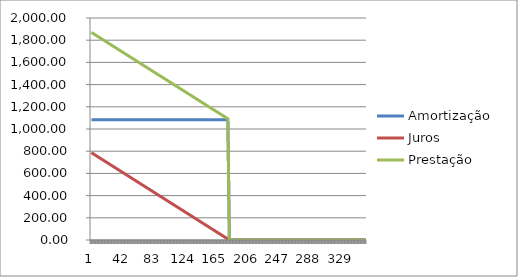
| Category | Amortização   | Juros   | Prestação   |
|---|---|---|---|
| 0 | 1083.546 | 786.837 | 1870.383 |
| 1 | 1083.546 | 782.466 | 1866.012 |
| 2 | 1083.546 | 778.094 | 1861.64 |
| 3 | 1083.546 | 773.723 | 1857.269 |
| 4 | 1083.546 | 769.352 | 1852.898 |
| 5 | 1083.546 | 764.981 | 1848.526 |
| 6 | 1083.546 | 760.609 | 1844.155 |
| 7 | 1083.546 | 756.238 | 1839.784 |
| 8 | 1083.546 | 751.867 | 1835.412 |
| 9 | 1083.546 | 747.495 | 1831.041 |
| 10 | 1083.546 | 743.124 | 1826.67 |
| 11 | 1083.546 | 738.753 | 1822.298 |
| 12 | 1083.546 | 734.381 | 1817.927 |
| 13 | 1083.546 | 730.01 | 1813.556 |
| 14 | 1083.546 | 725.639 | 1809.185 |
| 15 | 1083.546 | 721.267 | 1804.813 |
| 16 | 1083.546 | 716.896 | 1800.442 |
| 17 | 1083.546 | 712.525 | 1796.071 |
| 18 | 1083.546 | 708.153 | 1791.699 |
| 19 | 1083.546 | 703.782 | 1787.328 |
| 20 | 1083.546 | 699.411 | 1782.957 |
| 21 | 1083.546 | 695.039 | 1778.585 |
| 22 | 1083.546 | 690.668 | 1774.214 |
| 23 | 1083.546 | 686.297 | 1769.843 |
| 24 | 1083.546 | 681.926 | 1765.471 |
| 25 | 1083.546 | 677.554 | 1761.1 |
| 26 | 1083.546 | 673.183 | 1756.729 |
| 27 | 1083.546 | 668.812 | 1752.357 |
| 28 | 1083.546 | 664.44 | 1747.986 |
| 29 | 1083.546 | 660.069 | 1743.615 |
| 30 | 1083.546 | 655.698 | 1739.243 |
| 31 | 1083.546 | 651.326 | 1734.872 |
| 32 | 1083.546 | 646.955 | 1730.501 |
| 33 | 1083.546 | 642.584 | 1726.129 |
| 34 | 1083.546 | 638.212 | 1721.758 |
| 35 | 1083.546 | 633.841 | 1717.387 |
| 36 | 1083.546 | 629.47 | 1713.016 |
| 37 | 1083.546 | 625.098 | 1708.644 |
| 38 | 1083.546 | 620.727 | 1704.273 |
| 39 | 1083.546 | 616.356 | 1699.902 |
| 40 | 1083.546 | 611.984 | 1695.53 |
| 41 | 1083.546 | 607.613 | 1691.159 |
| 42 | 1083.546 | 603.242 | 1686.788 |
| 43 | 1083.546 | 598.87 | 1682.416 |
| 44 | 1083.546 | 594.499 | 1678.045 |
| 45 | 1083.546 | 590.128 | 1673.674 |
| 46 | 1083.546 | 585.757 | 1669.302 |
| 47 | 1083.546 | 581.385 | 1664.931 |
| 48 | 1083.546 | 577.014 | 1660.56 |
| 49 | 1083.546 | 572.643 | 1656.188 |
| 50 | 1083.546 | 568.271 | 1651.817 |
| 51 | 1083.546 | 563.9 | 1647.446 |
| 52 | 1083.546 | 559.529 | 1643.074 |
| 53 | 1083.546 | 555.157 | 1638.703 |
| 54 | 1083.546 | 550.786 | 1634.332 |
| 55 | 1083.546 | 546.415 | 1629.961 |
| 56 | 1083.546 | 542.043 | 1625.589 |
| 57 | 1083.546 | 537.672 | 1621.218 |
| 58 | 1083.546 | 533.301 | 1616.847 |
| 59 | 1083.546 | 528.929 | 1612.475 |
| 60 | 1083.546 | 524.558 | 1608.104 |
| 61 | 1083.546 | 520.187 | 1603.733 |
| 62 | 1083.546 | 515.815 | 1599.361 |
| 63 | 1083.546 | 511.444 | 1594.99 |
| 64 | 1083.546 | 507.073 | 1590.619 |
| 65 | 1083.546 | 502.702 | 1586.247 |
| 66 | 1083.546 | 498.33 | 1581.876 |
| 67 | 1083.546 | 493.959 | 1577.505 |
| 68 | 1083.546 | 489.588 | 1573.133 |
| 69 | 1083.546 | 485.216 | 1568.762 |
| 70 | 1083.546 | 480.845 | 1564.391 |
| 71 | 1083.546 | 476.474 | 1560.019 |
| 72 | 1083.546 | 472.102 | 1555.648 |
| 73 | 1083.546 | 467.731 | 1551.277 |
| 74 | 1083.546 | 463.36 | 1546.905 |
| 75 | 1083.546 | 458.988 | 1542.534 |
| 76 | 1083.546 | 454.617 | 1538.163 |
| 77 | 1083.546 | 450.246 | 1533.792 |
| 78 | 1083.546 | 445.874 | 1529.42 |
| 79 | 1083.546 | 441.503 | 1525.049 |
| 80 | 1083.546 | 437.132 | 1520.678 |
| 81 | 1083.546 | 432.76 | 1516.306 |
| 82 | 1083.546 | 428.389 | 1511.935 |
| 83 | 1083.546 | 424.018 | 1507.564 |
| 84 | 1083.546 | 419.646 | 1503.192 |
| 85 | 1083.546 | 415.275 | 1498.821 |
| 86 | 1083.546 | 410.904 | 1494.45 |
| 87 | 1083.546 | 406.533 | 1490.078 |
| 88 | 1083.546 | 402.161 | 1485.707 |
| 89 | 1083.546 | 397.79 | 1481.336 |
| 90 | 1083.546 | 393.419 | 1476.964 |
| 91 | 1083.546 | 389.047 | 1472.593 |
| 92 | 1083.546 | 384.676 | 1468.222 |
| 93 | 1083.546 | 380.305 | 1463.85 |
| 94 | 1083.546 | 375.933 | 1459.479 |
| 95 | 1083.546 | 371.562 | 1455.108 |
| 96 | 1083.546 | 367.191 | 1450.736 |
| 97 | 1083.546 | 362.819 | 1446.365 |
| 98 | 1083.546 | 358.448 | 1441.994 |
| 99 | 1083.546 | 354.077 | 1437.623 |
| 100 | 1083.546 | 349.705 | 1433.251 |
| 101 | 1083.546 | 345.334 | 1428.88 |
| 102 | 1083.546 | 340.963 | 1424.509 |
| 103 | 1083.546 | 336.591 | 1420.137 |
| 104 | 1083.546 | 332.22 | 1415.766 |
| 105 | 1083.546 | 327.849 | 1411.395 |
| 106 | 1083.546 | 323.477 | 1407.023 |
| 107 | 1083.546 | 319.106 | 1402.652 |
| 108 | 1083.546 | 314.735 | 1398.281 |
| 109 | 1083.546 | 310.364 | 1393.909 |
| 110 | 1083.546 | 305.992 | 1389.538 |
| 111 | 1083.546 | 301.621 | 1385.167 |
| 112 | 1083.546 | 297.25 | 1380.795 |
| 113 | 1083.546 | 292.878 | 1376.424 |
| 114 | 1083.546 | 288.507 | 1372.053 |
| 115 | 1083.546 | 284.136 | 1367.681 |
| 116 | 1083.546 | 279.764 | 1363.31 |
| 117 | 1083.546 | 275.393 | 1358.939 |
| 118 | 1083.546 | 271.022 | 1354.568 |
| 119 | 1083.546 | 266.65 | 1350.196 |
| 120 | 1083.546 | 262.279 | 1345.825 |
| 121 | 1083.546 | 257.908 | 1341.454 |
| 122 | 1083.546 | 253.536 | 1337.082 |
| 123 | 1083.546 | 249.165 | 1332.711 |
| 124 | 1083.546 | 244.794 | 1328.34 |
| 125 | 1083.546 | 240.422 | 1323.968 |
| 126 | 1083.546 | 236.051 | 1319.597 |
| 127 | 1083.546 | 231.68 | 1315.226 |
| 128 | 1083.546 | 227.309 | 1310.854 |
| 129 | 1083.546 | 222.937 | 1306.483 |
| 130 | 1083.546 | 218.566 | 1302.112 |
| 131 | 1083.546 | 214.195 | 1297.74 |
| 132 | 1083.546 | 209.823 | 1293.369 |
| 133 | 1083.546 | 205.452 | 1288.998 |
| 134 | 1083.546 | 201.081 | 1284.626 |
| 135 | 1083.546 | 196.709 | 1280.255 |
| 136 | 1083.546 | 192.338 | 1275.884 |
| 137 | 1083.546 | 187.967 | 1271.512 |
| 138 | 1083.546 | 183.595 | 1267.141 |
| 139 | 1083.546 | 179.224 | 1262.77 |
| 140 | 1083.546 | 174.853 | 1258.399 |
| 141 | 1083.546 | 170.481 | 1254.027 |
| 142 | 1083.546 | 166.11 | 1249.656 |
| 143 | 1083.546 | 161.739 | 1245.285 |
| 144 | 1083.546 | 157.367 | 1240.913 |
| 145 | 1083.546 | 152.996 | 1236.542 |
| 146 | 1083.546 | 148.625 | 1232.171 |
| 147 | 1083.546 | 144.253 | 1227.799 |
| 148 | 1083.546 | 139.882 | 1223.428 |
| 149 | 1083.546 | 135.511 | 1219.057 |
| 150 | 1083.546 | 131.14 | 1214.685 |
| 151 | 1083.546 | 126.768 | 1210.314 |
| 152 | 1083.546 | 122.397 | 1205.943 |
| 153 | 1083.546 | 118.026 | 1201.571 |
| 154 | 1083.546 | 113.654 | 1197.2 |
| 155 | 1083.546 | 109.283 | 1192.829 |
| 156 | 1083.546 | 104.912 | 1188.457 |
| 157 | 1083.546 | 100.54 | 1184.086 |
| 158 | 1083.546 | 96.169 | 1179.715 |
| 159 | 1083.546 | 91.798 | 1175.343 |
| 160 | 1083.546 | 87.426 | 1170.972 |
| 161 | 1083.546 | 83.055 | 1166.601 |
| 162 | 1083.546 | 78.684 | 1162.23 |
| 163 | 1083.546 | 74.312 | 1157.858 |
| 164 | 1083.546 | 69.941 | 1153.487 |
| 165 | 1083.546 | 65.57 | 1149.116 |
| 166 | 1083.546 | 61.198 | 1144.744 |
| 167 | 1083.546 | 56.827 | 1140.373 |
| 168 | 1083.546 | 52.456 | 1136.002 |
| 169 | 1083.546 | 48.084 | 1131.63 |
| 170 | 1083.546 | 43.713 | 1127.259 |
| 171 | 1083.546 | 39.342 | 1122.888 |
| 172 | 1083.546 | 34.971 | 1118.516 |
| 173 | 1083.546 | 30.599 | 1114.145 |
| 174 | 1083.546 | 26.228 | 1109.774 |
| 175 | 1083.546 | 21.857 | 1105.402 |
| 176 | 1083.546 | 17.485 | 1101.031 |
| 177 | 1083.546 | 13.114 | 1096.66 |
| 178 | 1083.546 | 8.743 | 1092.288 |
| 179 | 1083.546 | 4.371 | 1087.917 |
| 180 | 0 | 0 | 0 |
| 181 | 0 | 0 | 0 |
| 182 | 0 | 0 | 0 |
| 183 | 0 | 0 | 0 |
| 184 | 0 | 0 | 0 |
| 185 | 0 | 0 | 0 |
| 186 | 0 | 0 | 0 |
| 187 | 0 | 0 | 0 |
| 188 | 0 | 0 | 0 |
| 189 | 0 | 0 | 0 |
| 190 | 0 | 0 | 0 |
| 191 | 0 | 0 | 0 |
| 192 | 0 | 0 | 0 |
| 193 | 0 | 0 | 0 |
| 194 | 0 | 0 | 0 |
| 195 | 0 | 0 | 0 |
| 196 | 0 | 0 | 0 |
| 197 | 0 | 0 | 0 |
| 198 | 0 | 0 | 0 |
| 199 | 0 | 0 | 0 |
| 200 | 0 | 0 | 0 |
| 201 | 0 | 0 | 0 |
| 202 | 0 | 0 | 0 |
| 203 | 0 | 0 | 0 |
| 204 | 0 | 0 | 0 |
| 205 | 0 | 0 | 0 |
| 206 | 0 | 0 | 0 |
| 207 | 0 | 0 | 0 |
| 208 | 0 | 0 | 0 |
| 209 | 0 | 0 | 0 |
| 210 | 0 | 0 | 0 |
| 211 | 0 | 0 | 0 |
| 212 | 0 | 0 | 0 |
| 213 | 0 | 0 | 0 |
| 214 | 0 | 0 | 0 |
| 215 | 0 | 0 | 0 |
| 216 | 0 | 0 | 0 |
| 217 | 0 | 0 | 0 |
| 218 | 0 | 0 | 0 |
| 219 | 0 | 0 | 0 |
| 220 | 0 | 0 | 0 |
| 221 | 0 | 0 | 0 |
| 222 | 0 | 0 | 0 |
| 223 | 0 | 0 | 0 |
| 224 | 0 | 0 | 0 |
| 225 | 0 | 0 | 0 |
| 226 | 0 | 0 | 0 |
| 227 | 0 | 0 | 0 |
| 228 | 0 | 0 | 0 |
| 229 | 0 | 0 | 0 |
| 230 | 0 | 0 | 0 |
| 231 | 0 | 0 | 0 |
| 232 | 0 | 0 | 0 |
| 233 | 0 | 0 | 0 |
| 234 | 0 | 0 | 0 |
| 235 | 0 | 0 | 0 |
| 236 | 0 | 0 | 0 |
| 237 | 0 | 0 | 0 |
| 238 | 0 | 0 | 0 |
| 239 | 0 | 0 | 0 |
| 240 | 0 | 0 | 0 |
| 241 | 0 | 0 | 0 |
| 242 | 0 | 0 | 0 |
| 243 | 0 | 0 | 0 |
| 244 | 0 | 0 | 0 |
| 245 | 0 | 0 | 0 |
| 246 | 0 | 0 | 0 |
| 247 | 0 | 0 | 0 |
| 248 | 0 | 0 | 0 |
| 249 | 0 | 0 | 0 |
| 250 | 0 | 0 | 0 |
| 251 | 0 | 0 | 0 |
| 252 | 0 | 0 | 0 |
| 253 | 0 | 0 | 0 |
| 254 | 0 | 0 | 0 |
| 255 | 0 | 0 | 0 |
| 256 | 0 | 0 | 0 |
| 257 | 0 | 0 | 0 |
| 258 | 0 | 0 | 0 |
| 259 | 0 | 0 | 0 |
| 260 | 0 | 0 | 0 |
| 261 | 0 | 0 | 0 |
| 262 | 0 | 0 | 0 |
| 263 | 0 | 0 | 0 |
| 264 | 0 | 0 | 0 |
| 265 | 0 | 0 | 0 |
| 266 | 0 | 0 | 0 |
| 267 | 0 | 0 | 0 |
| 268 | 0 | 0 | 0 |
| 269 | 0 | 0 | 0 |
| 270 | 0 | 0 | 0 |
| 271 | 0 | 0 | 0 |
| 272 | 0 | 0 | 0 |
| 273 | 0 | 0 | 0 |
| 274 | 0 | 0 | 0 |
| 275 | 0 | 0 | 0 |
| 276 | 0 | 0 | 0 |
| 277 | 0 | 0 | 0 |
| 278 | 0 | 0 | 0 |
| 279 | 0 | 0 | 0 |
| 280 | 0 | 0 | 0 |
| 281 | 0 | 0 | 0 |
| 282 | 0 | 0 | 0 |
| 283 | 0 | 0 | 0 |
| 284 | 0 | 0 | 0 |
| 285 | 0 | 0 | 0 |
| 286 | 0 | 0 | 0 |
| 287 | 0 | 0 | 0 |
| 288 | 0 | 0 | 0 |
| 289 | 0 | 0 | 0 |
| 290 | 0 | 0 | 0 |
| 291 | 0 | 0 | 0 |
| 292 | 0 | 0 | 0 |
| 293 | 0 | 0 | 0 |
| 294 | 0 | 0 | 0 |
| 295 | 0 | 0 | 0 |
| 296 | 0 | 0 | 0 |
| 297 | 0 | 0 | 0 |
| 298 | 0 | 0 | 0 |
| 299 | 0 | 0 | 0 |
| 300 | 0 | 0 | 0 |
| 301 | 0 | 0 | 0 |
| 302 | 0 | 0 | 0 |
| 303 | 0 | 0 | 0 |
| 304 | 0 | 0 | 0 |
| 305 | 0 | 0 | 0 |
| 306 | 0 | 0 | 0 |
| 307 | 0 | 0 | 0 |
| 308 | 0 | 0 | 0 |
| 309 | 0 | 0 | 0 |
| 310 | 0 | 0 | 0 |
| 311 | 0 | 0 | 0 |
| 312 | 0 | 0 | 0 |
| 313 | 0 | 0 | 0 |
| 314 | 0 | 0 | 0 |
| 315 | 0 | 0 | 0 |
| 316 | 0 | 0 | 0 |
| 317 | 0 | 0 | 0 |
| 318 | 0 | 0 | 0 |
| 319 | 0 | 0 | 0 |
| 320 | 0 | 0 | 0 |
| 321 | 0 | 0 | 0 |
| 322 | 0 | 0 | 0 |
| 323 | 0 | 0 | 0 |
| 324 | 0 | 0 | 0 |
| 325 | 0 | 0 | 0 |
| 326 | 0 | 0 | 0 |
| 327 | 0 | 0 | 0 |
| 328 | 0 | 0 | 0 |
| 329 | 0 | 0 | 0 |
| 330 | 0 | 0 | 0 |
| 331 | 0 | 0 | 0 |
| 332 | 0 | 0 | 0 |
| 333 | 0 | 0 | 0 |
| 334 | 0 | 0 | 0 |
| 335 | 0 | 0 | 0 |
| 336 | 0 | 0 | 0 |
| 337 | 0 | 0 | 0 |
| 338 | 0 | 0 | 0 |
| 339 | 0 | 0 | 0 |
| 340 | 0 | 0 | 0 |
| 341 | 0 | 0 | 0 |
| 342 | 0 | 0 | 0 |
| 343 | 0 | 0 | 0 |
| 344 | 0 | 0 | 0 |
| 345 | 0 | 0 | 0 |
| 346 | 0 | 0 | 0 |
| 347 | 0 | 0 | 0 |
| 348 | 0 | 0 | 0 |
| 349 | 0 | 0 | 0 |
| 350 | 0 | 0 | 0 |
| 351 | 0 | 0 | 0 |
| 352 | 0 | 0 | 0 |
| 353 | 0 | 0 | 0 |
| 354 | 0 | 0 | 0 |
| 355 | 0 | 0 | 0 |
| 356 | 0 | 0 | 0 |
| 357 | 0 | 0 | 0 |
| 358 | 0 | 0 | 0 |
| 359 | 0 | 0 | 0 |